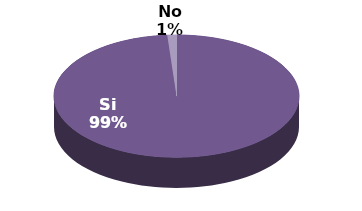
| Category | Series 1 |
|---|---|
| Si | 82 |
| No | 1 |